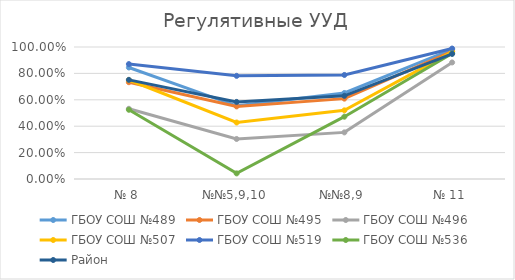
| Category | ГБОУ СОШ №489 | ГБОУ СОШ №495 | ГБОУ СОШ №496 | ГБОУ СОШ №507 | ГБОУ СОШ №519 | ГБОУ СОШ №536 | Район |
|---|---|---|---|---|---|---|---|
| № 8 | 0.845 | 0.733 | 0.532 | 0.75 | 0.871 | 0.525 | 0.751 |
| №№5,9,10 | 0.555 | 0.55 | 0.303 | 0.428 | 0.781 | 0.043 | 0.584 |
| №№8,9 | 0.652 | 0.609 | 0.353 | 0.52 | 0.788 | 0.472 | 0.63 |
| № 11 | 0.983 | 0.967 | 0.883 | 0.963 | 0.988 | 0.951 | 0.948 |